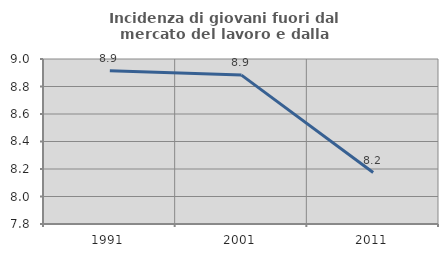
| Category | Incidenza di giovani fuori dal mercato del lavoro e dalla formazione  |
|---|---|
| 1991.0 | 8.915 |
| 2001.0 | 8.883 |
| 2011.0 | 8.174 |